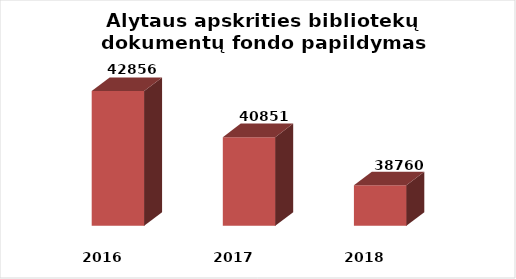
| Category | Series 0 |
|---|---|
| 2016.0 | 42856 |
| 2017.0 | 40851 |
| 2018.0 | 38760 |